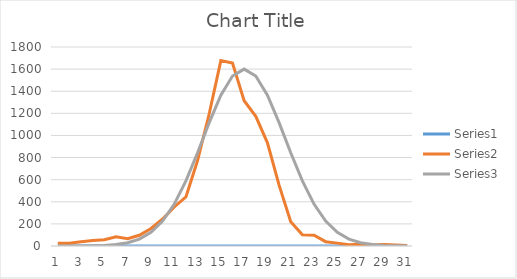
| Category | Series 0 | Series 1 | Series 2 |
|---|---|---|---|
| 0 | 0.239 | 25 | 0.057 |
| 1 | 0.24 | 24 | 0.197 |
| 2 | 0.241 | 39 | 0.63 |
| 3 | 0.242 | 49 | 1.855 |
| 4 | 0.243 | 56 | 5.042 |
| 5 | 0.244 | 84 | 12.651 |
| 6 | 0.245 | 66 | 29.305 |
| 7 | 0.246 | 97 | 62.662 |
| 8 | 0.247 | 158 | 123.688 |
| 9 | 0.248 | 244 | 225.373 |
| 10 | 0.249 | 353 | 379.084 |
| 11 | 0.25 | 444 | 588.607 |
| 12 | 0.251 | 773 | 843.668 |
| 13 | 0.252 | 1196 | 1116.282 |
| 14 | 0.253 | 1677 | 1363.43 |
| 15 | 0.254 | 1654 | 1537.263 |
| 16 | 0.255 | 1314 | 1600 |
| 17 | 0.256 | 1173 | 1537.263 |
| 18 | 0.257 | 933 | 1363.43 |
| 19 | 0.258 | 550 | 1116.282 |
| 20 | 0.259 | 220 | 843.668 |
| 21 | 0.26 | 101 | 588.607 |
| 22 | 0.261 | 97 | 379.084 |
| 23 | 0.262 | 39 | 225.373 |
| 24 | 0.263 | 26 | 123.688 |
| 25 | 0.264 | 11 | 62.662 |
| 26 | 0.265 | 16 | 29.305 |
| 27 | 0.266 | 10 | 12.651 |
| 28 | 0.267 | 13 | 5.042 |
| 29 | 0.268 | 8 | 1.855 |
| 30 | 0.269 | 5 | 0.63 |